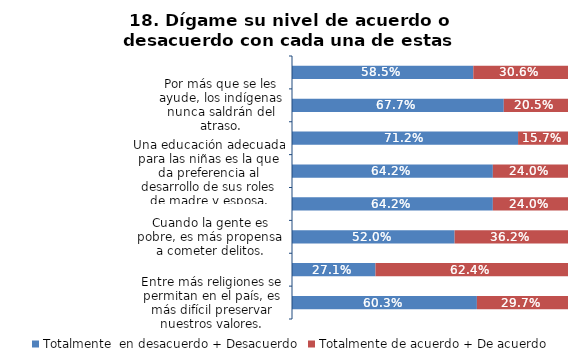
| Category | Totalmente  en desacuerdo + Desacuerdo | Totalmente de acuerdo + De acuerdo |
|---|---|---|
| Entre más religiones se permitan en el país, es más difícil preservar nuestros valores. | 0.603 | 0.297 |
| A los homosexuales se les debe permitir ser profesores de colegio. | 0.271 | 0.624 |
| Cuando la gente es pobre, es más propensa a cometer delitos. | 0.52 | 0.362 |
| Por sus características, los negros siempre tendrán limitaciones. | 0.642 | 0.24 |
| Una educación adecuada para las niñas es la que da preferencia al desarrollo de sus roles de madre y esposa. | 0.642 | 0.24 |
| Las personas enfermas de SIDA deben ser alejadas del resto de las personas. | 0.712 | 0.157 |
| Por más que se les ayude, los indígenas nunca saldrán del atraso. | 0.677 | 0.205 |
| Las personas discapacitadas pueden ser buenas trabajadoras, pero no en niveles directivos. | 0.585 | 0.306 |